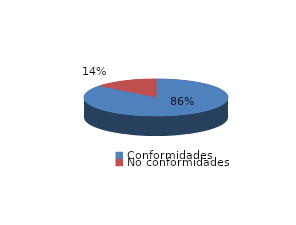
| Category | Series 0 |
|---|---|
| Conformidades | 1025 |
| No conformidades | 170 |